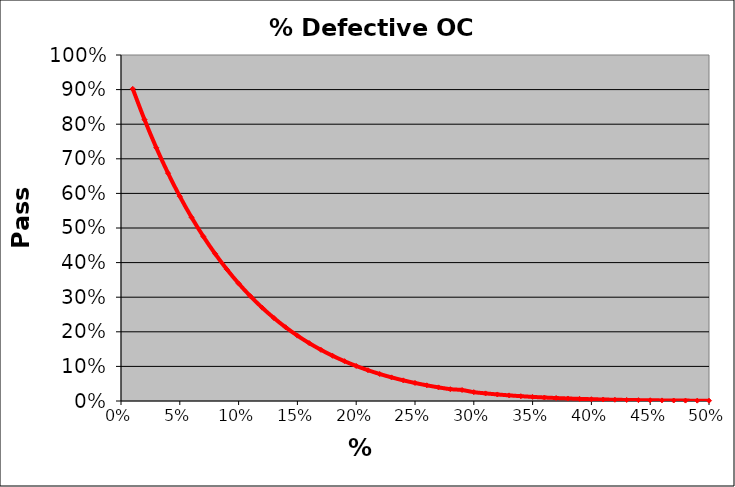
| Category | PASS 
RATE |
|---|---|
| 0.01 | 0.902 |
| 0.02 | 0.813 |
| 0.03 | 0.732 |
| 0.04 | 0.658 |
| 0.05 | 0.591 |
| 0.06 | 0.531 |
| 0.07 | 0.476 |
| 0.08 | 0.426 |
| 0.09 | 0.381 |
| 0.1 | 0.34 |
| 0.11 | 0.303 |
| 0.12 | 0.27 |
| 0.13 | 0.24 |
| 0.14 | 0.213 |
| 0.15 | 0.189 |
| 0.16 | 0.167 |
| 0.17 | 0.148 |
| 0.18 | 0.131 |
| 0.19 | 0.115 |
| 0.2 | 0.101 |
| 0.21 | 0.089 |
| 0.22 | 0.078 |
| 0.23 | 0.068 |
| 0.24 | 0.06 |
| 0.25 | 0.052 |
| 0.26 | 0.045 |
| 0.27 | 0.039 |
| 0.28 | 0.034 |
| 0.29 | 0.032 |
| 0.3 | 0.026 |
| 0.31 | 0.022 |
| 0.32 | 0.019 |
| 0.33 | 0.016 |
| 0.34 | 0.014 |
| 0.35 | 0.012 |
| 0.36 | 0.01 |
| 0.37 | 0.009 |
| 0.38 | 0.007 |
| 0.39 | 0.006 |
| 0.4 | 0.005 |
| 0.41 | 0.004 |
| 0.42 | 0.004 |
| 0.43 | 0.003 |
| 0.44 | 0.003 |
| 0.45 | 0.002 |
| 0.46 | 0.002 |
| 0.47 | 0.001 |
| 0.48 | 0.001 |
| 0.49 | 0.001 |
| 0.499999999999999 | 0.001 |